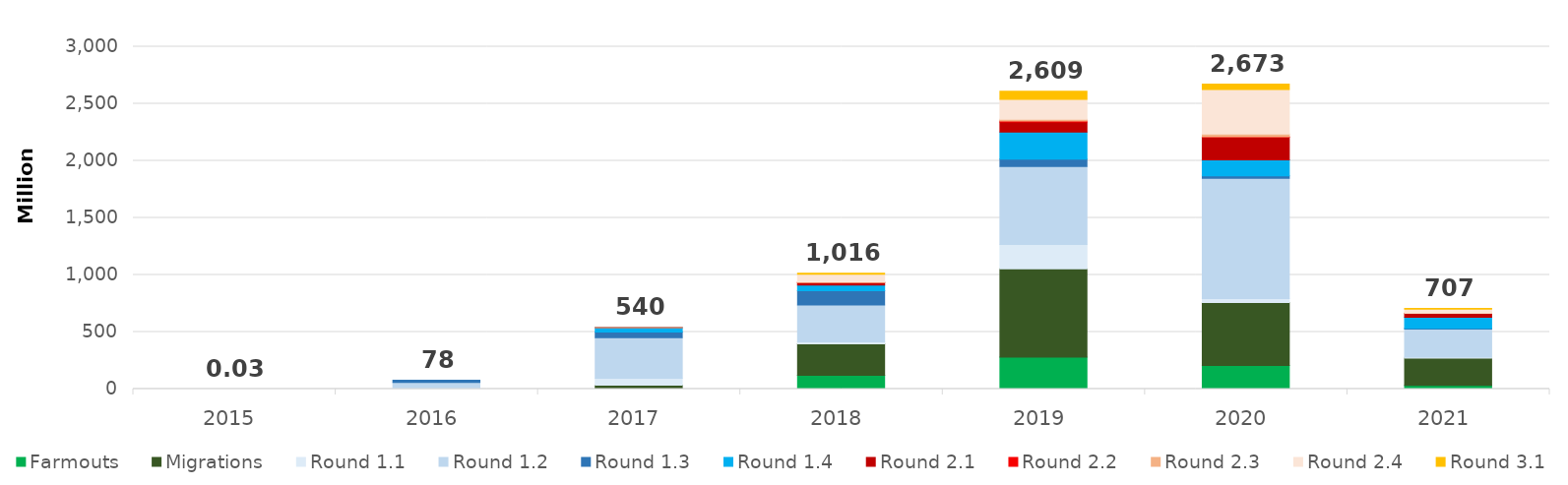
| Category | Farmouts | Migrations | Round 1.1 | Round 1.2 | Round 1.3 | Round 1.4 | Round 2.1 | Round 2.2 | Round 2.3 | Round 2.4 | Round 3.1 |
|---|---|---|---|---|---|---|---|---|---|---|---|
| 2015.0 | 0 | 0 | 0.023 | 0.003 | 0 | 0 | 0 | 0 | 0 | 0 | 0 |
| 2016.0 | 0 | 0 | 7.936 | 50.902 | 19.085 | 0 | 0 | 0 | 0 | 0 | 0 |
| 2017.0 | 1.551 | 32.93 | 60.276 | 356.292 | 49.062 | 38.707 | 0.93 | 0 | 0.096 | 0 | 0 |
| 2018.0 | 121.371 | 276.221 | 16.154 | 323.201 | 126.084 | 47.616 | 21.584 | 0.843 | 6.737 | 66.299 | 9.669 |
| 2019.0 | 280.617 | 772.208 | 213.486 | 685.106 | 64.244 | 235.595 | 88.72 | 9.392 | 14.554 | 175.703 | 69.349 |
| 2020.0 | 207.708 | 550.53 | 33.998 | 1054.149 | 22.253 | 140.295 | 198.226 | 3.04 | 23.879 | 391.695 | 46.857 |
| 2021.0 | 33.33 | 239.188 | 6.899 | 247.518 | 5.66 | 96.434 | 35.42 | 0.044 | 2.139 | 34.828 | 5.807 |